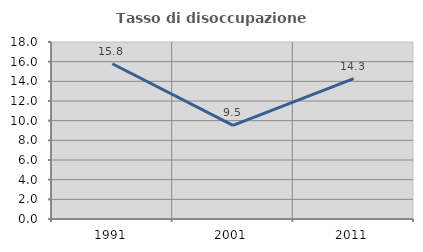
| Category | Tasso di disoccupazione giovanile  |
|---|---|
| 1991.0 | 15.789 |
| 2001.0 | 9.524 |
| 2011.0 | 14.286 |